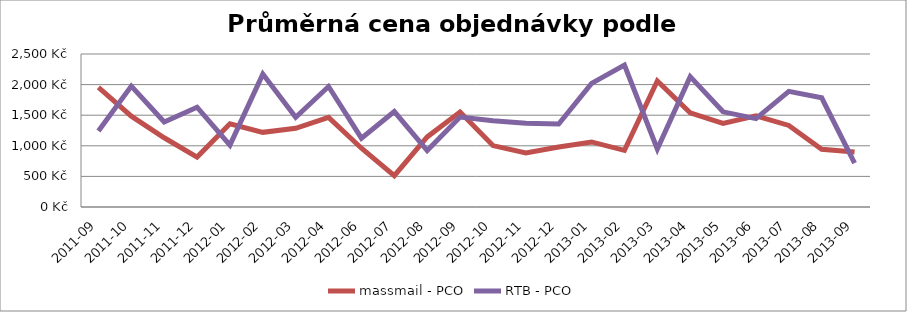
| Category | massmail - PCO | RTB - PCO |
|---|---|---|
| 2011-09 | 1953.439 | 1240.375 |
| 2011-10 | 1484.37 | 1975.884 |
| 2011-11 | 1131.058 | 1388.226 |
| 2011-12 | 815.762 | 1630.845 |
| 2012-01 | 1360.292 | 1010.363 |
| 2012-02 | 1219.676 | 2171.743 |
| 2012-03 | 1285.793 | 1466.732 |
| 2012-04 | 1463.559 | 1968.569 |
| 2012-06 | 959.971 | 1124.406 |
| 2012-07 | 512.612 | 1559.192 |
| 2012-08 | 1145 | 923.075 |
| 2012-09 | 1550.924 | 1469.285 |
| 2012-10 | 1003.343 | 1410.41 |
| 2012-11 | 882.432 | 1368.913 |
| 2012-12 | 981.267 | 1355.581 |
| 2013-01 | 1062.999 | 2019.666 |
| 2013-02 | 924.699 | 2317.422 |
| 2013-03 | 2059.742 | 947.785 |
| 2013-04 | 1537.744 | 2130.071 |
| 2013-05 | 1365.473 | 1555.096 |
| 2013-06 | 1490.579 | 1443.607 |
| 2013-07 | 1333.21 | 1888.722 |
| 2013-08 | 944.071 | 1784.822 |
| 2013-09 | 898.015 | 718.116 |